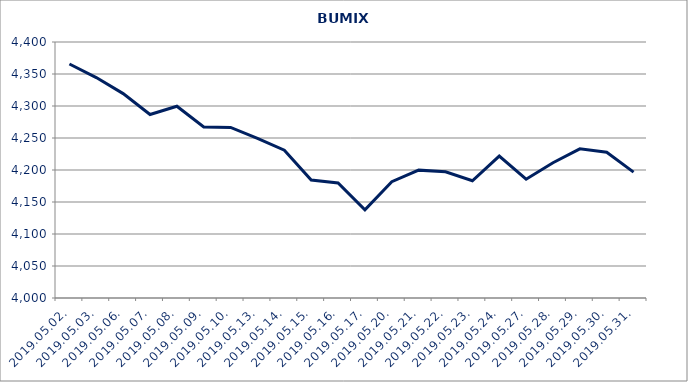
| Category | BUMIX |
|---|---|
| 2019.05.02. | 4365.66 |
| 2019.05.03. | 4344.454 |
| 2019.05.06. | 4319.386 |
| 2019.05.07. | 4286.74 |
| 2019.05.08. | 4299.692 |
| 2019.05.09. | 4267.243 |
| 2019.05.10. | 4266.527 |
| 2019.05.13. | 4249.324 |
| 2019.05.14. | 4230.907 |
| 2019.05.15. | 4184.385 |
| 2019.05.16. | 4179.726 |
| 2019.05.17. | 4137.848 |
| 2019.05.20. | 4181.669 |
| 2019.05.21. | 4199.779 |
| 2019.05.22. | 4197.152 |
| 2019.05.23. | 4183.188 |
| 2019.05.24. | 4221.728 |
| 2019.05.27. | 4185.532 |
| 2019.05.28. | 4211.345 |
| 2019.05.29. | 4233.062 |
| 2019.05.30. | 4227.658 |
| 2019.05.31. | 4196.665 |